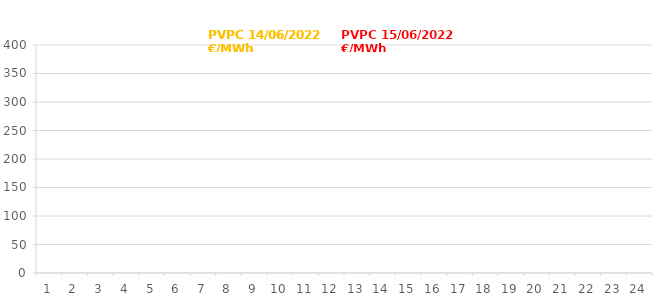
| Category | PVPC 14/06/2022
€/MWh | PVPC 15/06/2022
€/MWh |
|---|---|---|
| 1.0 | 266.95 | 311.85 |
| 2.0 | 266.34 | 310.04 |
| 3.0 | 254.41 | 309.45 |
| 4.0 | 249.73 | 308.39 |
| 5.0 | 244.74 | 309.25 |
| 6.0 | 248.96 | 317.24 |
| 7.0 | 261.12 | 306.79 |
| 8.0 | 274.29 | 301.17 |
| 9.0 | 300.68 | 318.53 |
| 10.0 | 291.95 | 293.99 |
| 11.0 | 332.44 | 323.21 |
| 12.0 | 317.75 | 318.03 |
| 13.0 | 313.79 | 318.49 |
| 14.0 | 313.36 | 319.3 |
| 15.0 | 265.42 | 267.74 |
| 16.0 | 258.4 | 257.79 |
| 17.0 | 268.77 | 261.46 |
| 18.0 | 271.23 | 260.72 |
| 19.0 | 325.92 | 309.83 |
| 20.0 | 340.65 | 328.61 |
| 21.0 | 361.8 | 356.12 |
| 22.0 | 366.25 | 358.24 |
| 23.0 | 309.93 | 309.05 |
| 24.0 | 292.87 | 282.86 |